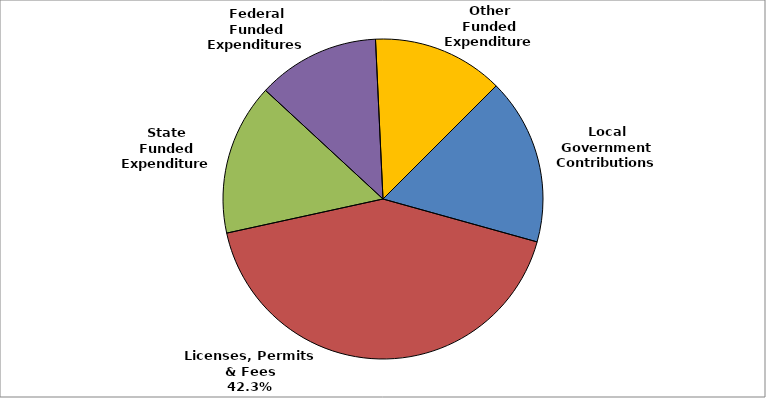
| Category | Series 0 |
|---|---|
| Local Government Contributions | 0.168 |
| Licenses, Permits & Fees | 0.423 |
| State Funded Expenditures | 0.153 |
| Federal Funded Expenditures | 0.124 |
| Other Funded Expenditures | 0.132 |